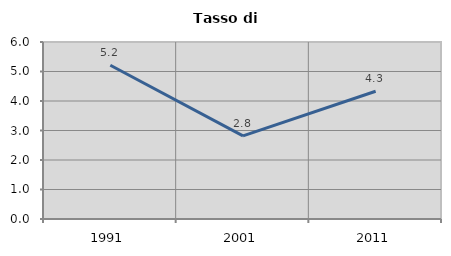
| Category | Tasso di disoccupazione   |
|---|---|
| 1991.0 | 5.211 |
| 2001.0 | 2.819 |
| 2011.0 | 4.332 |